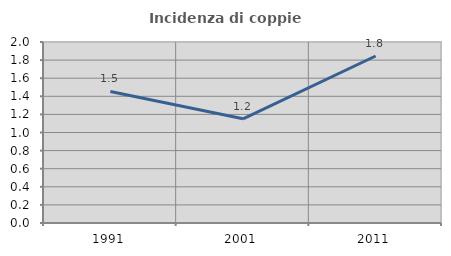
| Category | Incidenza di coppie miste |
|---|---|
| 1991.0 | 1.454 |
| 2001.0 | 1.151 |
| 2011.0 | 1.845 |